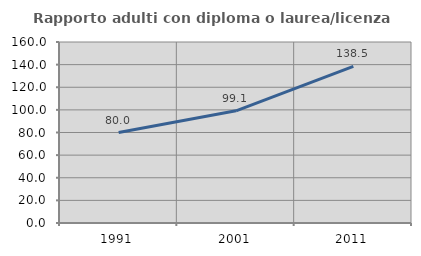
| Category | Rapporto adulti con diploma o laurea/licenza media  |
|---|---|
| 1991.0 | 80 |
| 2001.0 | 99.148 |
| 2011.0 | 138.507 |